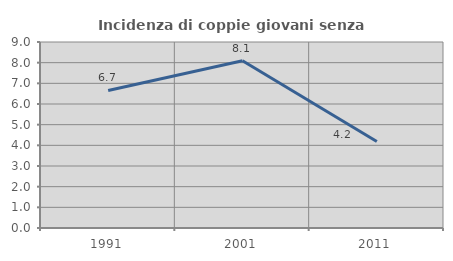
| Category | Incidenza di coppie giovani senza figli |
|---|---|
| 1991.0 | 6.655 |
| 2001.0 | 8.095 |
| 2011.0 | 4.19 |